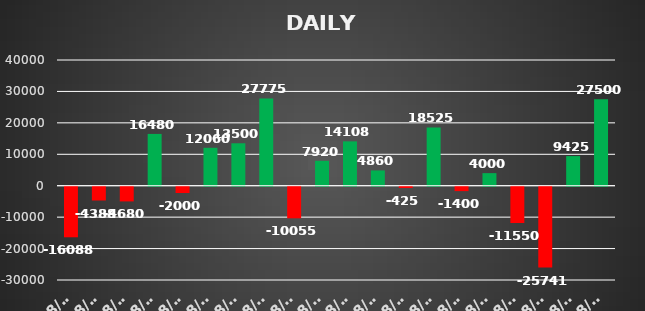
| Category | Series 0 |
|---|---|
| 2022-08-01 | -16088 |
| 2022-08-02 | -4387.5 |
| 2022-08-02 | -4680 |
| 2022-08-03 | 16480 |
| 2022-08-04 | -2000 |
| 2022-08-05 | 12060 |
| 2022-08-08 | 13500 |
| 2022-08-10 | 27775 |
| 2022-08-11 | -10055 |
| 2022-08-12 | 7920 |
| 2022-08-16 | 14107.5 |
| 2022-08-17 | 4860 |
| 2022-08-18 | -425 |
| 2022-08-22 | 18525 |
| 2022-08-23 | -1400 |
| 2022-08-24 | 4000 |
| 2022-08-25 | -11550 |
| 2022-08-26 | -25740.8 |
| 2022-08-29 | 9425 |
| 2022-08-30 | 27500 |